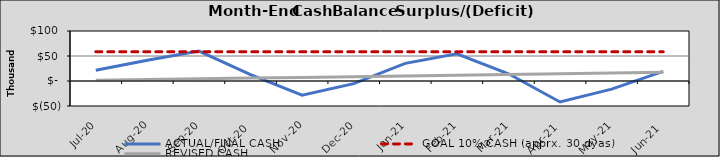
| Category | ACTUAL/FINAL CASH | GOAL 10% CASH (apprx. 30 dyas) | REVISED CASH |
|---|---|---|---|
| 2020-07-01 | 21475.364 | 58516.087 | 1449.23 |
| 2020-08-01 | 41397.674 | 58516.087 | 2898.46 |
| 2020-09-01 | 59859.108 | 58516.087 | 4347.69 |
| 2020-10-02 | 12749.418 | 58516.087 | 5796.92 |
| 2020-11-02 | -28465.448 | 58516.087 | 7246.15 |
| 2020-12-03 | -5280.313 | 58516.087 | 8695.38 |
| 2021-01-03 | 35263.946 | 58516.087 | 10144.61 |
| 2021-02-03 | 54285.151 | 58516.087 | 11593.84 |
| 2021-03-06 | 14399.23 | 58516.087 | 13043.07 |
| 2021-04-06 | -42015.635 | 58516.087 | 14492.3 |
| 2021-05-07 | -16230.501 | 58516.087 | 15941.53 |
| 2021-06-07 | 19129.286 | 58516.087 | 17390.76 |